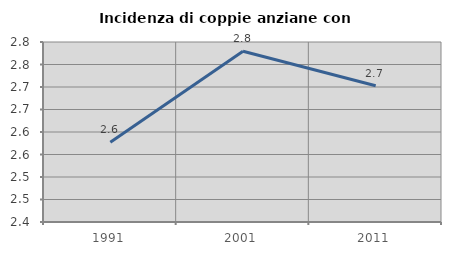
| Category | Incidenza di coppie anziane con figli |
|---|---|
| 1991.0 | 2.577 |
| 2001.0 | 2.779 |
| 2011.0 | 2.703 |